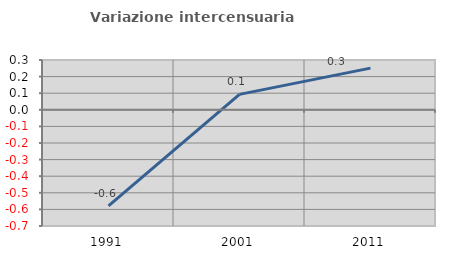
| Category | Variazione intercensuaria annua |
|---|---|
| 1991.0 | -0.579 |
| 2001.0 | 0.093 |
| 2011.0 | 0.251 |